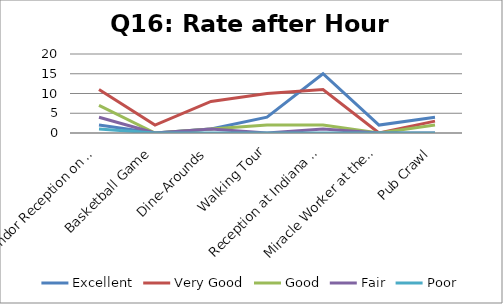
| Category | Excellent | Very Good | Good | Fair | Poor |
|---|---|---|---|---|---|
| Vendor Reception on Wednesday Evening | 2 | 11 | 7 | 4 | 1 |
| Basketball Game | 0 | 2 | 0 | 0 | 0 |
| Dine-Arounds | 1 | 8 | 1 | 1 | 0 |
| Walking Tour | 4 | 10 | 2 | 0 | 0 |
| Reception at Indiana State Library on Friday Evening | 15 | 11 | 2 | 1 | 0 |
| Miracle Worker at the Indiana Repertory Theater | 2 | 0 | 0 | 0 | 0 |
| Pub Crawl | 4 | 3 | 2 | 0 | 0 |